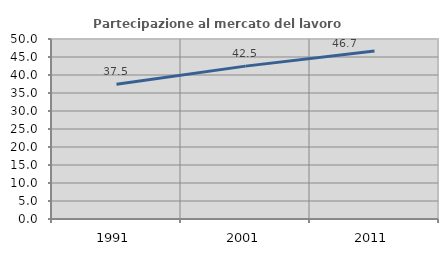
| Category | Partecipazione al mercato del lavoro  femminile |
|---|---|
| 1991.0 | 37.457 |
| 2001.0 | 42.464 |
| 2011.0 | 46.688 |